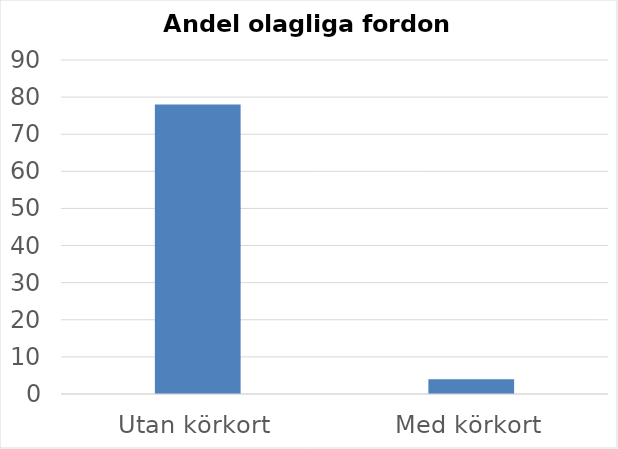
| Category | Andel % |
|---|---|
| Utan körkort | 78 |
| Med körkort | 4 |